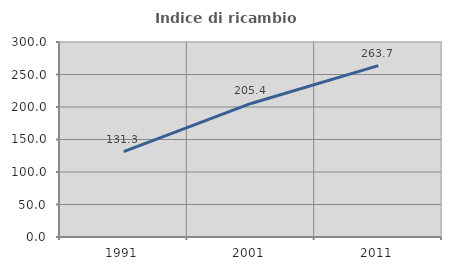
| Category | Indice di ricambio occupazionale  |
|---|---|
| 1991.0 | 131.25 |
| 2001.0 | 205.444 |
| 2011.0 | 263.679 |